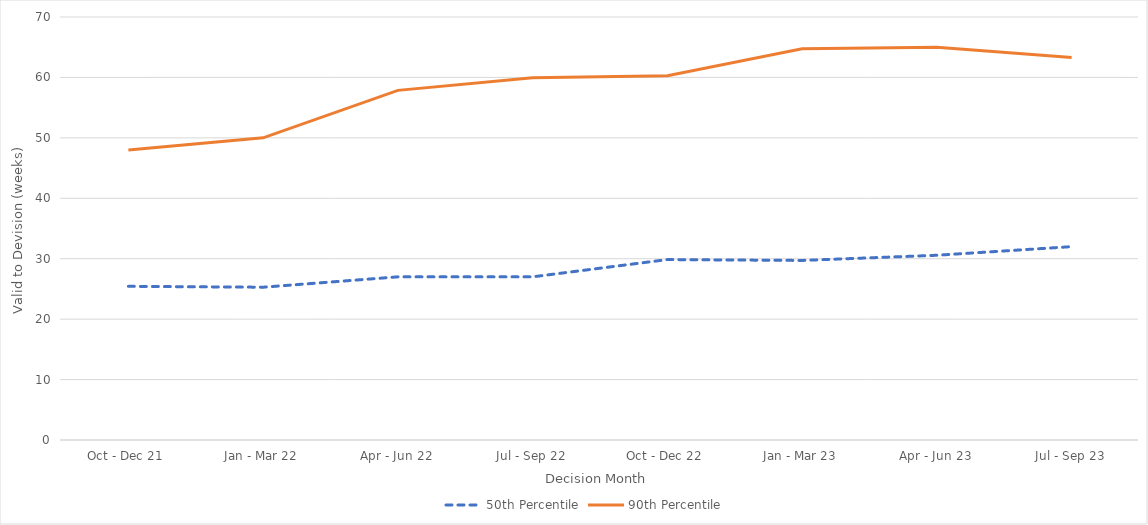
| Category | 50th Percentile | 90th Percentile |
|---|---|---|
| Oct - Dec 21 | 25.429 | 48 |
| Jan - Mar 22 | 25.286 | 50 |
| Apr - Jun 22 | 27 | 57.857 |
| Jul - Sep 22 | 27 | 59.943 |
| Oct - Dec 22 | 29.857 | 60.286 |
| Jan - Mar 23 | 29.714 | 64.757 |
| Apr - Jun 23 | 30.571 | 65 |
| Jul - Sep 23 | 32 | 63.286 |